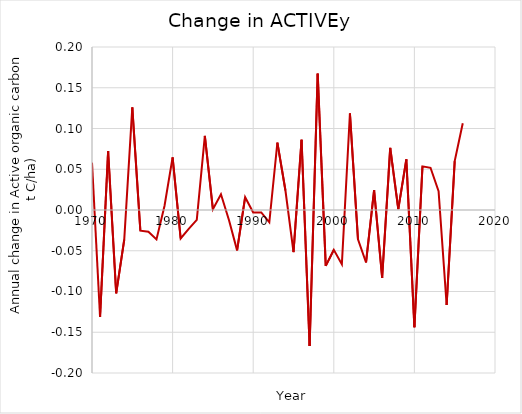
| Category | Series 0 |
|---|---|
| 1970.0 | 0.058 |
| 1971.0 | -0.131 |
| 1972.0 | 0.072 |
| 1973.0 | -0.102 |
| 1974.0 | -0.036 |
| 1975.0 | 0.126 |
| 1976.0 | -0.025 |
| 1977.0 | -0.027 |
| 1978.0 | -0.036 |
| 1979.0 | 0.005 |
| 1980.0 | 0.064 |
| 1981.0 | -0.035 |
| 1982.0 | -0.023 |
| 1983.0 | -0.012 |
| 1984.0 | 0.091 |
| 1985.0 | 0.001 |
| 1986.0 | 0.019 |
| 1987.0 | -0.013 |
| 1988.0 | -0.05 |
| 1989.0 | 0.016 |
| 1990.0 | -0.003 |
| 1991.0 | -0.003 |
| 1992.0 | -0.015 |
| 1993.0 | 0.083 |
| 1994.0 | 0.024 |
| 1995.0 | -0.052 |
| 1996.0 | 0.086 |
| 1997.0 | -0.167 |
| 1998.0 | 0.167 |
| 1999.0 | -0.069 |
| 2000.0 | -0.049 |
| 2001.0 | -0.067 |
| 2002.0 | 0.118 |
| 2003.0 | -0.036 |
| 2004.0 | -0.064 |
| 2005.0 | 0.024 |
| 2006.0 | -0.083 |
| 2007.0 | 0.076 |
| 2008.0 | 0.001 |
| 2009.0 | 0.062 |
| 2010.0 | -0.144 |
| 2011.0 | 0.054 |
| 2012.0 | 0.052 |
| 2013.0 | 0.023 |
| 2014.0 | -0.117 |
| 2015.0 | 0.06 |
| 2016.0 | 0.106 |